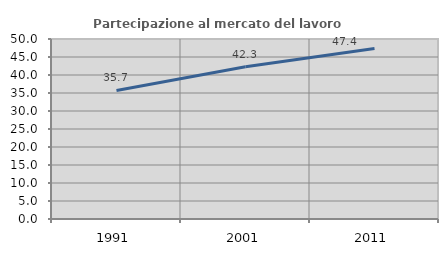
| Category | Partecipazione al mercato del lavoro  femminile |
|---|---|
| 1991.0 | 35.714 |
| 2001.0 | 42.314 |
| 2011.0 | 47.368 |